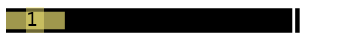
| Category | Ziel abnahme | Ist abgenommen |
|---|---|---|
| 0 | 5 | 1 |